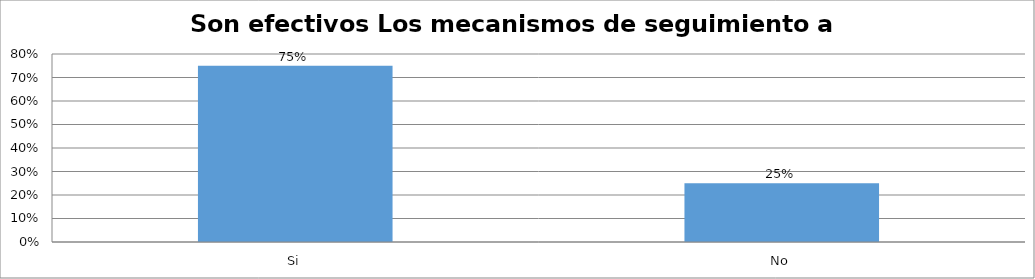
| Category | Series 0 |
|---|---|
| Si | 0.75 |
| No | 0.25 |